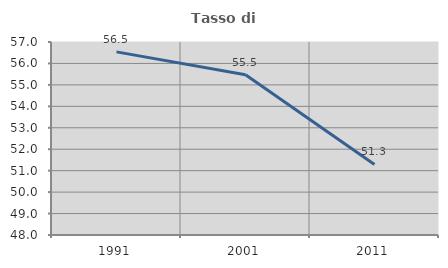
| Category | Tasso di occupazione   |
|---|---|
| 1991.0 | 56.54 |
| 2001.0 | 55.473 |
| 2011.0 | 51.288 |